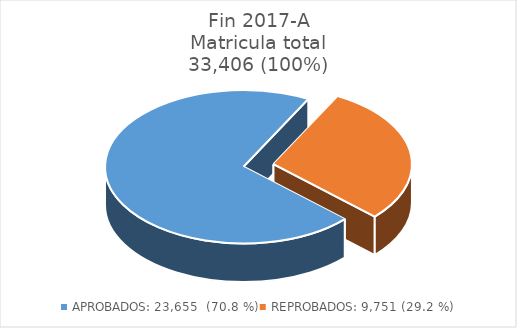
| Category | Series 0 |
|---|---|
| APROBADOS: 23,655  (70.8 %) | 23655 |
| REPROBADOS: 9,751 (29.2 %) | 9751 |